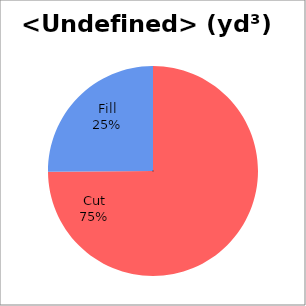
| Category | Series 0 |
|---|---|
| Cut | 16454.478 |
| Fill | 5517.618 |